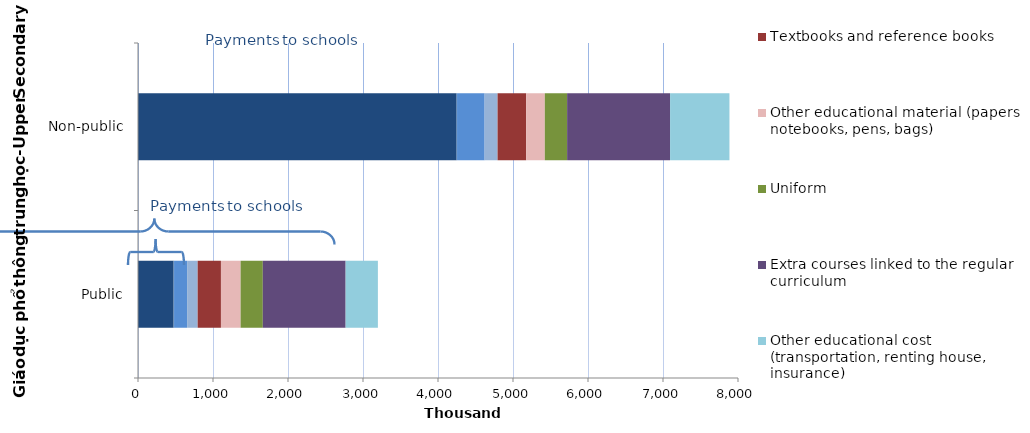
| Category | School fees | Additional fees for attending school outside the pupil’s districts | Contribution to school construction fund | Contribution to parent fund, pupil fund, or class fund | Textbooks and reference books | Other educational material (papers, notebooks, pens, bags) | Uniform | Extra courses linked to the regular curriculum | Other educational cost (transportation, renting house, insurance) |
|---|---|---|---|---|---|---|---|---|---|
| Public | 472.671 | 8.049 | 174.267 | 140.551 | 310.423 | 262.105 | 296.155 | 1104.256 | 430.014 |
| Non-public | 4243.603 | 10.255 | 367.975 | 172.412 | 381.503 | 248.401 | 297.41 | 1372.794 | 791.551 |